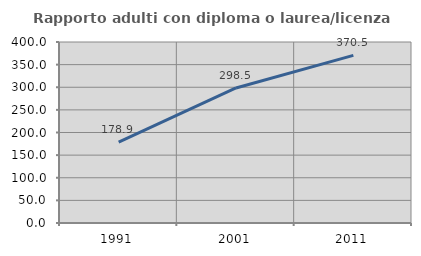
| Category | Rapporto adulti con diploma o laurea/licenza media  |
|---|---|
| 1991.0 | 178.925 |
| 2001.0 | 298.49 |
| 2011.0 | 370.474 |